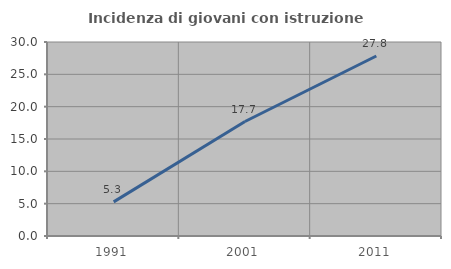
| Category | Incidenza di giovani con istruzione universitaria |
|---|---|
| 1991.0 | 5.279 |
| 2001.0 | 17.702 |
| 2011.0 | 27.839 |